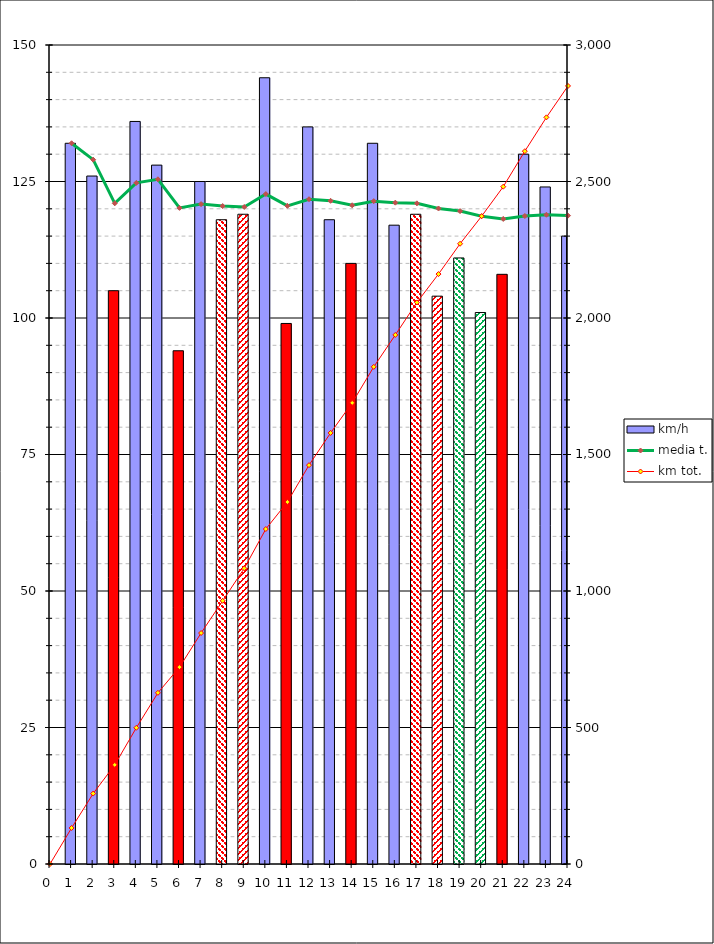
| Category | km/h |
|---|---|
| 0.0 | 0 |
| 1.0 | 132 |
| 2.0 | 126 |
| 3.0 | 105 |
| 4.0 | 136 |
| 5.0 | 128 |
| 6.0 | 94 |
| 7.0 | 125 |
| 8.0 | 118 |
| 9.0 | 119 |
| 10.0 | 144 |
| 11.0 | 99 |
| 12.0 | 135 |
| 13.0 | 118 |
| 14.0 | 110 |
| 15.0 | 132 |
| 16.0 | 117 |
| 17.0 | 119 |
| 18.0 | 104 |
| 19.0 | 111 |
| 20.0 | 101 |
| 21.0 | 108 |
| 22.0 | 130 |
| 23.0 | 124 |
| 24.0 | 115 |